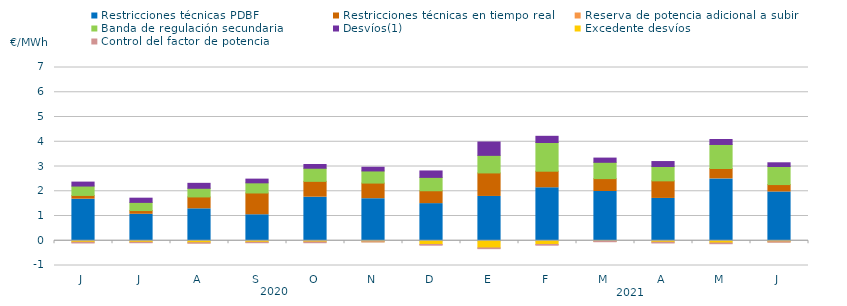
| Category | Restricciones técnicas PDBF | Restricciones técnicas en tiempo real | Reserva de potencia adicional a subir | Banda de regulación secundaria | Desvíos(1) | Excedente desvíos | Control del factor de potencia |
|---|---|---|---|---|---|---|---|
| J | 1.68 | 0.15 | 0 | 0.38 | 0.16 | -0.06 | -0.07 |
| J | 1.07 | 0.15 | 0 | 0.33 | 0.17 | -0.06 | -0.06 |
| A | 1.29 | 0.48 | 0 | 0.35 | 0.2 | -0.08 | -0.06 |
| S | 1.05 | 0.88 | 0 | 0.41 | 0.15 | -0.06 | -0.06 |
| O | 1.76 | 0.64 | 0 | 0.53 | 0.15 | -0.05 | -0.07 |
| N | 1.7 | 0.63 | 0 | 0.49 | 0.15 | -0.04 | -0.05 |
| D | 1.5 | 0.52 | 0 | 0.54 | 0.26 | -0.15 | -0.07 |
| E | 1.79 | 0.95 | 0 | 0.71 | 0.54 | -0.29 | -0.07 |
| F | 2.14 | 0.67 | 0 | 1.16 | 0.25 | -0.15 | -0.07 |
| M | 1.99 | 0.52 | 0 | 0.66 | 0.17 | -0.02 | -0.06 |
| A | 1.71 | 0.71 | 0 | 0.58 | 0.2 | -0.06 | -0.07 |
| M | 2.5 | 0.42 | 0 | 0.97 | 0.2 | -0.09 | -0.07 |
| J | 1.97 | 0.3 | 0 | 0.73 | 0.15 | -0.04 | -0.06 |